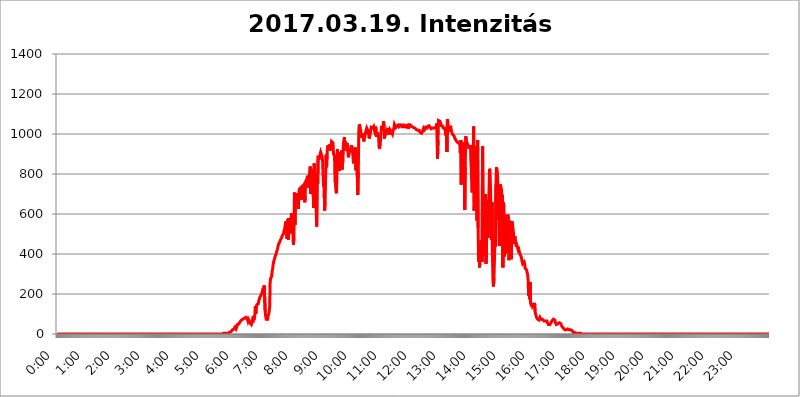
| Category | 2017.03.19. Intenzitás [W/m^2] |
|---|---|
| 0.0 | 0 |
| 0.0006944444444444445 | 0 |
| 0.001388888888888889 | 0 |
| 0.0020833333333333333 | 0 |
| 0.002777777777777778 | 0 |
| 0.003472222222222222 | 0 |
| 0.004166666666666667 | 0 |
| 0.004861111111111111 | 0 |
| 0.005555555555555556 | 0 |
| 0.0062499999999999995 | 0 |
| 0.006944444444444444 | 0 |
| 0.007638888888888889 | 0 |
| 0.008333333333333333 | 0 |
| 0.009027777777777779 | 0 |
| 0.009722222222222222 | 0 |
| 0.010416666666666666 | 0 |
| 0.011111111111111112 | 0 |
| 0.011805555555555555 | 0 |
| 0.012499999999999999 | 0 |
| 0.013194444444444444 | 0 |
| 0.013888888888888888 | 0 |
| 0.014583333333333332 | 0 |
| 0.015277777777777777 | 0 |
| 0.015972222222222224 | 0 |
| 0.016666666666666666 | 0 |
| 0.017361111111111112 | 0 |
| 0.018055555555555557 | 0 |
| 0.01875 | 0 |
| 0.019444444444444445 | 0 |
| 0.02013888888888889 | 0 |
| 0.020833333333333332 | 0 |
| 0.02152777777777778 | 0 |
| 0.022222222222222223 | 0 |
| 0.02291666666666667 | 0 |
| 0.02361111111111111 | 0 |
| 0.024305555555555556 | 0 |
| 0.024999999999999998 | 0 |
| 0.025694444444444447 | 0 |
| 0.02638888888888889 | 0 |
| 0.027083333333333334 | 0 |
| 0.027777777777777776 | 0 |
| 0.02847222222222222 | 0 |
| 0.029166666666666664 | 0 |
| 0.029861111111111113 | 0 |
| 0.030555555555555555 | 0 |
| 0.03125 | 0 |
| 0.03194444444444445 | 0 |
| 0.03263888888888889 | 0 |
| 0.03333333333333333 | 0 |
| 0.034027777777777775 | 0 |
| 0.034722222222222224 | 0 |
| 0.035416666666666666 | 0 |
| 0.036111111111111115 | 0 |
| 0.03680555555555556 | 0 |
| 0.0375 | 0 |
| 0.03819444444444444 | 0 |
| 0.03888888888888889 | 0 |
| 0.03958333333333333 | 0 |
| 0.04027777777777778 | 0 |
| 0.04097222222222222 | 0 |
| 0.041666666666666664 | 0 |
| 0.042361111111111106 | 0 |
| 0.04305555555555556 | 0 |
| 0.043750000000000004 | 0 |
| 0.044444444444444446 | 0 |
| 0.04513888888888889 | 0 |
| 0.04583333333333334 | 0 |
| 0.04652777777777778 | 0 |
| 0.04722222222222222 | 0 |
| 0.04791666666666666 | 0 |
| 0.04861111111111111 | 0 |
| 0.049305555555555554 | 0 |
| 0.049999999999999996 | 0 |
| 0.05069444444444445 | 0 |
| 0.051388888888888894 | 0 |
| 0.052083333333333336 | 0 |
| 0.05277777777777778 | 0 |
| 0.05347222222222222 | 0 |
| 0.05416666666666667 | 0 |
| 0.05486111111111111 | 0 |
| 0.05555555555555555 | 0 |
| 0.05625 | 0 |
| 0.05694444444444444 | 0 |
| 0.057638888888888885 | 0 |
| 0.05833333333333333 | 0 |
| 0.05902777777777778 | 0 |
| 0.059722222222222225 | 0 |
| 0.06041666666666667 | 0 |
| 0.061111111111111116 | 0 |
| 0.06180555555555556 | 0 |
| 0.0625 | 0 |
| 0.06319444444444444 | 0 |
| 0.06388888888888888 | 0 |
| 0.06458333333333334 | 0 |
| 0.06527777777777778 | 0 |
| 0.06597222222222222 | 0 |
| 0.06666666666666667 | 0 |
| 0.06736111111111111 | 0 |
| 0.06805555555555555 | 0 |
| 0.06874999999999999 | 0 |
| 0.06944444444444443 | 0 |
| 0.07013888888888889 | 0 |
| 0.07083333333333333 | 0 |
| 0.07152777777777779 | 0 |
| 0.07222222222222223 | 0 |
| 0.07291666666666667 | 0 |
| 0.07361111111111111 | 0 |
| 0.07430555555555556 | 0 |
| 0.075 | 0 |
| 0.07569444444444444 | 0 |
| 0.0763888888888889 | 0 |
| 0.07708333333333334 | 0 |
| 0.07777777777777778 | 0 |
| 0.07847222222222222 | 0 |
| 0.07916666666666666 | 0 |
| 0.0798611111111111 | 0 |
| 0.08055555555555556 | 0 |
| 0.08125 | 0 |
| 0.08194444444444444 | 0 |
| 0.08263888888888889 | 0 |
| 0.08333333333333333 | 0 |
| 0.08402777777777777 | 0 |
| 0.08472222222222221 | 0 |
| 0.08541666666666665 | 0 |
| 0.08611111111111112 | 0 |
| 0.08680555555555557 | 0 |
| 0.08750000000000001 | 0 |
| 0.08819444444444445 | 0 |
| 0.08888888888888889 | 0 |
| 0.08958333333333333 | 0 |
| 0.09027777777777778 | 0 |
| 0.09097222222222222 | 0 |
| 0.09166666666666667 | 0 |
| 0.09236111111111112 | 0 |
| 0.09305555555555556 | 0 |
| 0.09375 | 0 |
| 0.09444444444444444 | 0 |
| 0.09513888888888888 | 0 |
| 0.09583333333333333 | 0 |
| 0.09652777777777777 | 0 |
| 0.09722222222222222 | 0 |
| 0.09791666666666667 | 0 |
| 0.09861111111111111 | 0 |
| 0.09930555555555555 | 0 |
| 0.09999999999999999 | 0 |
| 0.10069444444444443 | 0 |
| 0.1013888888888889 | 0 |
| 0.10208333333333335 | 0 |
| 0.10277777777777779 | 0 |
| 0.10347222222222223 | 0 |
| 0.10416666666666667 | 0 |
| 0.10486111111111111 | 0 |
| 0.10555555555555556 | 0 |
| 0.10625 | 0 |
| 0.10694444444444444 | 0 |
| 0.1076388888888889 | 0 |
| 0.10833333333333334 | 0 |
| 0.10902777777777778 | 0 |
| 0.10972222222222222 | 0 |
| 0.1111111111111111 | 0 |
| 0.11180555555555556 | 0 |
| 0.11180555555555556 | 0 |
| 0.1125 | 0 |
| 0.11319444444444444 | 0 |
| 0.11388888888888889 | 0 |
| 0.11458333333333333 | 0 |
| 0.11527777777777777 | 0 |
| 0.11597222222222221 | 0 |
| 0.11666666666666665 | 0 |
| 0.1173611111111111 | 0 |
| 0.11805555555555557 | 0 |
| 0.11944444444444445 | 0 |
| 0.12013888888888889 | 0 |
| 0.12083333333333333 | 0 |
| 0.12152777777777778 | 0 |
| 0.12222222222222223 | 0 |
| 0.12291666666666667 | 0 |
| 0.12291666666666667 | 0 |
| 0.12361111111111112 | 0 |
| 0.12430555555555556 | 0 |
| 0.125 | 0 |
| 0.12569444444444444 | 0 |
| 0.12638888888888888 | 0 |
| 0.12708333333333333 | 0 |
| 0.16875 | 0 |
| 0.12847222222222224 | 0 |
| 0.12916666666666668 | 0 |
| 0.12986111111111112 | 0 |
| 0.13055555555555556 | 0 |
| 0.13125 | 0 |
| 0.13194444444444445 | 0 |
| 0.1326388888888889 | 0 |
| 0.13333333333333333 | 0 |
| 0.13402777777777777 | 0 |
| 0.13402777777777777 | 0 |
| 0.13472222222222222 | 0 |
| 0.13541666666666666 | 0 |
| 0.1361111111111111 | 0 |
| 0.13749999999999998 | 0 |
| 0.13819444444444443 | 0 |
| 0.1388888888888889 | 0 |
| 0.13958333333333334 | 0 |
| 0.14027777777777778 | 0 |
| 0.14097222222222222 | 0 |
| 0.14166666666666666 | 0 |
| 0.1423611111111111 | 0 |
| 0.14305555555555557 | 0 |
| 0.14375000000000002 | 0 |
| 0.14444444444444446 | 0 |
| 0.1451388888888889 | 0 |
| 0.1451388888888889 | 0 |
| 0.14652777777777778 | 0 |
| 0.14722222222222223 | 0 |
| 0.14791666666666667 | 0 |
| 0.1486111111111111 | 0 |
| 0.14930555555555555 | 0 |
| 0.15 | 0 |
| 0.15069444444444444 | 0 |
| 0.15138888888888888 | 0 |
| 0.15208333333333332 | 0 |
| 0.15277777777777776 | 0 |
| 0.15347222222222223 | 0 |
| 0.15416666666666667 | 0 |
| 0.15486111111111112 | 0 |
| 0.15555555555555556 | 0 |
| 0.15625 | 0 |
| 0.15694444444444444 | 0 |
| 0.15763888888888888 | 0 |
| 0.15833333333333333 | 0 |
| 0.15902777777777777 | 0 |
| 0.15972222222222224 | 0 |
| 0.16041666666666668 | 0 |
| 0.16111111111111112 | 0 |
| 0.16180555555555556 | 0 |
| 0.1625 | 0 |
| 0.16319444444444445 | 0 |
| 0.1638888888888889 | 0 |
| 0.16458333333333333 | 0 |
| 0.16527777777777777 | 0 |
| 0.16597222222222222 | 0 |
| 0.16666666666666666 | 0 |
| 0.1673611111111111 | 0 |
| 0.16805555555555554 | 0 |
| 0.16874999999999998 | 0 |
| 0.16944444444444443 | 0 |
| 0.17013888888888887 | 0 |
| 0.1708333333333333 | 0 |
| 0.17152777777777775 | 0 |
| 0.17222222222222225 | 0 |
| 0.1729166666666667 | 0 |
| 0.17361111111111113 | 0 |
| 0.17430555555555557 | 0 |
| 0.17500000000000002 | 0 |
| 0.17569444444444446 | 0 |
| 0.1763888888888889 | 0 |
| 0.17708333333333334 | 0 |
| 0.17777777777777778 | 0 |
| 0.17847222222222223 | 0 |
| 0.17916666666666667 | 0 |
| 0.1798611111111111 | 0 |
| 0.18055555555555555 | 0 |
| 0.18125 | 0 |
| 0.18194444444444444 | 0 |
| 0.1826388888888889 | 0 |
| 0.18333333333333335 | 0 |
| 0.1840277777777778 | 0 |
| 0.18472222222222223 | 0 |
| 0.18541666666666667 | 0 |
| 0.18611111111111112 | 0 |
| 0.18680555555555556 | 0 |
| 0.1875 | 0 |
| 0.18819444444444444 | 0 |
| 0.18888888888888888 | 0 |
| 0.18958333333333333 | 0 |
| 0.19027777777777777 | 0 |
| 0.1909722222222222 | 0 |
| 0.19166666666666665 | 0 |
| 0.19236111111111112 | 0 |
| 0.19305555555555554 | 0 |
| 0.19375 | 0 |
| 0.19444444444444445 | 0 |
| 0.1951388888888889 | 0 |
| 0.19583333333333333 | 0 |
| 0.19652777777777777 | 0 |
| 0.19722222222222222 | 0 |
| 0.19791666666666666 | 0 |
| 0.1986111111111111 | 0 |
| 0.19930555555555554 | 0 |
| 0.19999999999999998 | 0 |
| 0.20069444444444443 | 0 |
| 0.20138888888888887 | 0 |
| 0.2020833333333333 | 0 |
| 0.2027777777777778 | 0 |
| 0.2034722222222222 | 0 |
| 0.2041666666666667 | 0 |
| 0.20486111111111113 | 0 |
| 0.20555555555555557 | 0 |
| 0.20625000000000002 | 0 |
| 0.20694444444444446 | 0 |
| 0.2076388888888889 | 0 |
| 0.20833333333333334 | 0 |
| 0.20902777777777778 | 0 |
| 0.20972222222222223 | 0 |
| 0.21041666666666667 | 0 |
| 0.2111111111111111 | 0 |
| 0.21180555555555555 | 0 |
| 0.2125 | 0 |
| 0.21319444444444444 | 0 |
| 0.2138888888888889 | 0 |
| 0.21458333333333335 | 0 |
| 0.2152777777777778 | 0 |
| 0.21597222222222223 | 0 |
| 0.21666666666666667 | 0 |
| 0.21736111111111112 | 0 |
| 0.21805555555555556 | 0 |
| 0.21875 | 0 |
| 0.21944444444444444 | 0 |
| 0.22013888888888888 | 0 |
| 0.22083333333333333 | 0 |
| 0.22152777777777777 | 0 |
| 0.2222222222222222 | 0 |
| 0.22291666666666665 | 0 |
| 0.2236111111111111 | 0 |
| 0.22430555555555556 | 0 |
| 0.225 | 0 |
| 0.22569444444444445 | 0 |
| 0.2263888888888889 | 0 |
| 0.22708333333333333 | 0 |
| 0.22777777777777777 | 0 |
| 0.22847222222222222 | 0 |
| 0.22916666666666666 | 0 |
| 0.2298611111111111 | 0 |
| 0.23055555555555554 | 0 |
| 0.23124999999999998 | 0 |
| 0.23194444444444443 | 0 |
| 0.23263888888888887 | 0 |
| 0.2333333333333333 | 3.525 |
| 0.2340277777777778 | 3.525 |
| 0.2347222222222222 | 3.525 |
| 0.2354166666666667 | 3.525 |
| 0.23611111111111113 | 3.525 |
| 0.23680555555555557 | 3.525 |
| 0.23750000000000002 | 3.525 |
| 0.23819444444444446 | 3.525 |
| 0.2388888888888889 | 3.525 |
| 0.23958333333333334 | 3.525 |
| 0.24027777777777778 | 7.887 |
| 0.24097222222222223 | 7.887 |
| 0.24166666666666667 | 7.887 |
| 0.2423611111111111 | 7.887 |
| 0.24305555555555555 | 12.257 |
| 0.24375 | 12.257 |
| 0.24444444444444446 | 16.636 |
| 0.24513888888888888 | 16.636 |
| 0.24583333333333335 | 21.024 |
| 0.2465277777777778 | 21.024 |
| 0.24722222222222223 | 25.419 |
| 0.24791666666666667 | 25.419 |
| 0.24861111111111112 | 29.823 |
| 0.24930555555555556 | 34.234 |
| 0.25 | 29.823 |
| 0.25069444444444444 | 25.419 |
| 0.2513888888888889 | 29.823 |
| 0.2520833333333333 | 38.653 |
| 0.25277777777777777 | 47.511 |
| 0.2534722222222222 | 47.511 |
| 0.25416666666666665 | 47.511 |
| 0.2548611111111111 | 51.951 |
| 0.2555555555555556 | 56.398 |
| 0.25625000000000003 | 60.85 |
| 0.2569444444444445 | 60.85 |
| 0.2576388888888889 | 65.31 |
| 0.25833333333333336 | 69.775 |
| 0.2590277777777778 | 74.246 |
| 0.25972222222222224 | 74.246 |
| 0.2604166666666667 | 74.246 |
| 0.2611111111111111 | 74.246 |
| 0.26180555555555557 | 74.246 |
| 0.2625 | 78.722 |
| 0.26319444444444445 | 78.722 |
| 0.2638888888888889 | 78.722 |
| 0.26458333333333334 | 83.205 |
| 0.2652777777777778 | 83.205 |
| 0.2659722222222222 | 87.692 |
| 0.26666666666666666 | 74.246 |
| 0.2673611111111111 | 65.31 |
| 0.26805555555555555 | 74.246 |
| 0.26875 | 78.722 |
| 0.26944444444444443 | 65.31 |
| 0.2701388888888889 | 56.398 |
| 0.2708333333333333 | 51.951 |
| 0.27152777777777776 | 51.951 |
| 0.2722222222222222 | 47.511 |
| 0.27291666666666664 | 51.951 |
| 0.2736111111111111 | 65.31 |
| 0.2743055555555555 | 56.398 |
| 0.27499999999999997 | 87.692 |
| 0.27569444444444446 | 69.775 |
| 0.27638888888888885 | 69.775 |
| 0.27708333333333335 | 92.184 |
| 0.2777777777777778 | 137.347 |
| 0.27847222222222223 | 101.184 |
| 0.2791666666666667 | 137.347 |
| 0.2798611111111111 | 146.423 |
| 0.28055555555555556 | 141.884 |
| 0.28125 | 150.964 |
| 0.28194444444444444 | 150.964 |
| 0.2826388888888889 | 164.605 |
| 0.2833333333333333 | 173.709 |
| 0.28402777777777777 | 182.82 |
| 0.2847222222222222 | 187.378 |
| 0.28541666666666665 | 187.378 |
| 0.28611111111111115 | 196.497 |
| 0.28680555555555554 | 201.058 |
| 0.28750000000000003 | 210.182 |
| 0.2881944444444445 | 214.746 |
| 0.2888888888888889 | 228.436 |
| 0.28958333333333336 | 210.182 |
| 0.2902777777777778 | 242.127 |
| 0.29097222222222224 | 237.564 |
| 0.2916666666666667 | 110.201 |
| 0.2923611111111111 | 87.692 |
| 0.29305555555555557 | 74.246 |
| 0.29375 | 74.246 |
| 0.29444444444444445 | 74.246 |
| 0.2951388888888889 | 74.246 |
| 0.29583333333333334 | 92.184 |
| 0.2965277777777778 | 92.184 |
| 0.2972222222222222 | 110.201 |
| 0.29791666666666666 | 137.347 |
| 0.2986111111111111 | 260.373 |
| 0.29930555555555555 | 278.603 |
| 0.3 | 283.156 |
| 0.30069444444444443 | 287.709 |
| 0.3013888888888889 | 314.98 |
| 0.3020833333333333 | 324.052 |
| 0.30277777777777776 | 346.682 |
| 0.3034722222222222 | 360.221 |
| 0.30416666666666664 | 369.23 |
| 0.3048611111111111 | 378.224 |
| 0.3055555555555555 | 387.202 |
| 0.30624999999999997 | 391.685 |
| 0.3069444444444444 | 400.638 |
| 0.3076388888888889 | 405.108 |
| 0.30833333333333335 | 418.492 |
| 0.3090277777777778 | 427.39 |
| 0.30972222222222223 | 440.702 |
| 0.3104166666666667 | 449.551 |
| 0.3111111111111111 | 453.968 |
| 0.31180555555555556 | 458.38 |
| 0.3125 | 462.786 |
| 0.31319444444444444 | 471.582 |
| 0.3138888888888889 | 475.972 |
| 0.3145833333333333 | 480.356 |
| 0.31527777777777777 | 489.108 |
| 0.3159722222222222 | 489.108 |
| 0.31666666666666665 | 493.475 |
| 0.31736111111111115 | 502.192 |
| 0.31805555555555554 | 515.223 |
| 0.31875000000000003 | 523.88 |
| 0.3194444444444445 | 536.82 |
| 0.3201388888888889 | 553.986 |
| 0.32083333333333336 | 562.53 |
| 0.3215277777777778 | 515.223 |
| 0.32222222222222224 | 475.972 |
| 0.3229166666666667 | 575.299 |
| 0.3236111111111111 | 493.475 |
| 0.32430555555555557 | 471.582 |
| 0.325 | 579.542 |
| 0.32569444444444445 | 575.299 |
| 0.3263888888888889 | 502.192 |
| 0.32708333333333334 | 515.223 |
| 0.3277777777777778 | 575.299 |
| 0.3284722222222222 | 604.864 |
| 0.32916666666666666 | 558.261 |
| 0.3298611111111111 | 510.885 |
| 0.33055555555555555 | 575.299 |
| 0.33125 | 445.129 |
| 0.33194444444444443 | 480.356 |
| 0.3326388888888889 | 707.8 |
| 0.3333333333333333 | 545.416 |
| 0.3340277777777778 | 703.762 |
| 0.3347222222222222 | 695.666 |
| 0.3354166666666667 | 695.666 |
| 0.3361111111111111 | 691.608 |
| 0.3368055555555556 | 683.473 |
| 0.33749999999999997 | 683.473 |
| 0.33819444444444446 | 625.784 |
| 0.33888888888888885 | 703.762 |
| 0.33958333333333335 | 723.889 |
| 0.34027777777777773 | 727.896 |
| 0.34097222222222223 | 727.896 |
| 0.3416666666666666 | 731.896 |
| 0.3423611111111111 | 671.22 |
| 0.3430555555555555 | 735.89 |
| 0.34375 | 719.877 |
| 0.3444444444444445 | 715.858 |
| 0.3451388888888889 | 735.89 |
| 0.3458333333333334 | 727.896 |
| 0.34652777777777777 | 747.834 |
| 0.34722222222222227 | 658.909 |
| 0.34791666666666665 | 755.766 |
| 0.34861111111111115 | 763.674 |
| 0.34930555555555554 | 767.62 |
| 0.35000000000000003 | 775.492 |
| 0.3506944444444444 | 783.342 |
| 0.3513888888888889 | 791.169 |
| 0.3520833333333333 | 731.896 |
| 0.3527777777777778 | 775.492 |
| 0.3534722222222222 | 798.974 |
| 0.3541666666666667 | 806.757 |
| 0.3548611111111111 | 837.682 |
| 0.35555555555555557 | 699.717 |
| 0.35625 | 791.169 |
| 0.35694444444444445 | 787.258 |
| 0.3576388888888889 | 826.123 |
| 0.35833333333333334 | 829.981 |
| 0.3590277777777778 | 687.544 |
| 0.3597222222222222 | 629.948 |
| 0.36041666666666666 | 853.029 |
| 0.3611111111111111 | 814.519 |
| 0.36180555555555555 | 791.169 |
| 0.3625 | 679.395 |
| 0.36319444444444443 | 613.252 |
| 0.3638888888888889 | 536.82 |
| 0.3645833333333333 | 787.258 |
| 0.3652777777777778 | 751.803 |
| 0.3659722222222222 | 891.099 |
| 0.3666666666666667 | 872.114 |
| 0.3673611111111111 | 879.719 |
| 0.3680555555555556 | 883.516 |
| 0.36874999999999997 | 883.516 |
| 0.36944444444444446 | 909.996 |
| 0.37013888888888885 | 902.447 |
| 0.37083333333333335 | 902.447 |
| 0.37152777777777773 | 883.516 |
| 0.37222222222222223 | 860.676 |
| 0.3729166666666666 | 787.258 |
| 0.3736111111111111 | 735.89 |
| 0.3743055555555555 | 743.859 |
| 0.375 | 617.436 |
| 0.3756944444444445 | 658.909 |
| 0.3763888888888889 | 779.42 |
| 0.3770833333333334 | 894.885 |
| 0.37777777777777777 | 833.834 |
| 0.37847222222222227 | 902.447 |
| 0.37916666666666665 | 936.33 |
| 0.37986111111111115 | 943.832 |
| 0.38055555555555554 | 928.819 |
| 0.38125000000000003 | 936.33 |
| 0.3819444444444444 | 947.58 |
| 0.3826388888888889 | 917.534 |
| 0.3833333333333333 | 917.534 |
| 0.3840277777777778 | 940.082 |
| 0.3847222222222222 | 962.555 |
| 0.3854166666666667 | 962.555 |
| 0.3861111111111111 | 966.295 |
| 0.38680555555555557 | 955.071 |
| 0.3875 | 898.668 |
| 0.38819444444444445 | 902.447 |
| 0.3888888888888889 | 891.099 |
| 0.38958333333333334 | 763.674 |
| 0.3902777777777778 | 751.803 |
| 0.3909722222222222 | 711.832 |
| 0.39166666666666666 | 703.762 |
| 0.3923611111111111 | 898.668 |
| 0.39305555555555555 | 925.06 |
| 0.39375 | 845.365 |
| 0.39444444444444443 | 909.996 |
| 0.3951388888888889 | 879.719 |
| 0.3958333333333333 | 814.519 |
| 0.3965277777777778 | 894.885 |
| 0.3972222222222222 | 841.526 |
| 0.3979166666666667 | 887.309 |
| 0.3986111111111111 | 917.534 |
| 0.3993055555555556 | 822.26 |
| 0.39999999999999997 | 849.199 |
| 0.40069444444444446 | 860.676 |
| 0.40138888888888885 | 955.071 |
| 0.40208333333333335 | 970.034 |
| 0.40277777777777773 | 984.98 |
| 0.40347222222222223 | 936.33 |
| 0.4041666666666666 | 962.555 |
| 0.4048611111111111 | 917.534 |
| 0.4055555555555555 | 943.832 |
| 0.40625 | 955.071 |
| 0.4069444444444445 | 943.832 |
| 0.4076388888888889 | 909.996 |
| 0.4083333333333334 | 883.516 |
| 0.40902777777777777 | 898.668 |
| 0.40972222222222227 | 902.447 |
| 0.41041666666666665 | 917.534 |
| 0.41111111111111115 | 917.534 |
| 0.41180555555555554 | 932.576 |
| 0.41250000000000003 | 943.832 |
| 0.4131944444444444 | 940.082 |
| 0.4138888888888889 | 925.06 |
| 0.4145833333333333 | 894.885 |
| 0.4152777777777778 | 860.676 |
| 0.4159722222222222 | 853.029 |
| 0.4166666666666667 | 872.114 |
| 0.4173611111111111 | 872.114 |
| 0.41805555555555557 | 932.576 |
| 0.41875 | 818.392 |
| 0.41944444444444445 | 829.981 |
| 0.4201388888888889 | 883.516 |
| 0.42083333333333334 | 783.342 |
| 0.4215277777777778 | 695.666 |
| 0.4222222222222222 | 810.641 |
| 0.42291666666666666 | 1014.852 |
| 0.4236111111111111 | 1048.508 |
| 0.42430555555555555 | 1041.019 |
| 0.425 | 1041.019 |
| 0.42569444444444443 | 1014.852 |
| 0.4263888888888889 | 981.244 |
| 0.4270833333333333 | 988.714 |
| 0.4277777777777778 | 992.448 |
| 0.4284722222222222 | 1003.65 |
| 0.4291666666666667 | 984.98 |
| 0.4298611111111111 | 962.555 |
| 0.4305555555555556 | 973.772 |
| 0.43124999999999997 | 984.98 |
| 0.43194444444444446 | 996.182 |
| 0.43263888888888885 | 1011.118 |
| 0.43333333333333335 | 1014.852 |
| 0.43402777777777773 | 1029.798 |
| 0.43472222222222223 | 1026.06 |
| 0.4354166666666666 | 1018.587 |
| 0.4361111111111111 | 1014.852 |
| 0.4368055555555555 | 999.916 |
| 0.4375 | 977.508 |
| 0.4381944444444445 | 973.772 |
| 0.4388888888888889 | 977.508 |
| 0.4395833333333334 | 1018.587 |
| 0.44027777777777777 | 1033.537 |
| 0.44097222222222227 | 1033.537 |
| 0.44166666666666665 | 1033.537 |
| 0.44236111111111115 | 1029.798 |
| 0.44305555555555554 | 1033.537 |
| 0.44375000000000003 | 1037.277 |
| 0.4444444444444444 | 1026.06 |
| 0.4451388888888889 | 1014.852 |
| 0.4458333333333333 | 1022.323 |
| 0.4465277777777778 | 1037.277 |
| 0.4472222222222222 | 1018.587 |
| 0.4479166666666667 | 984.98 |
| 0.4486111111111111 | 988.714 |
| 0.44930555555555557 | 1007.383 |
| 0.45 | 992.448 |
| 0.45069444444444445 | 984.98 |
| 0.4513888888888889 | 936.33 |
| 0.45208333333333334 | 925.06 |
| 0.4527777777777778 | 955.071 |
| 0.4534722222222222 | 966.295 |
| 0.45416666666666666 | 1011.118 |
| 0.4548611111111111 | 1041.019 |
| 0.45555555555555555 | 1029.798 |
| 0.45625 | 1018.587 |
| 0.45694444444444443 | 1029.798 |
| 0.4576388888888889 | 1063.51 |
| 0.4583333333333333 | 1033.537 |
| 0.4590277777777778 | 977.508 |
| 0.4597222222222222 | 1022.323 |
| 0.4604166666666667 | 1022.323 |
| 0.4611111111111111 | 1007.383 |
| 0.4618055555555556 | 1014.852 |
| 0.46249999999999997 | 1007.383 |
| 0.46319444444444446 | 1029.798 |
| 0.46388888888888885 | 1014.852 |
| 0.46458333333333335 | 1018.587 |
| 0.46527777777777773 | 996.182 |
| 0.46597222222222223 | 1007.383 |
| 0.4666666666666666 | 1022.323 |
| 0.4673611111111111 | 1018.587 |
| 0.4680555555555555 | 1014.852 |
| 0.46875 | 1018.587 |
| 0.4694444444444445 | 1011.118 |
| 0.4701388888888889 | 999.916 |
| 0.4708333333333334 | 1014.852 |
| 0.47152777777777777 | 1022.323 |
| 0.47222222222222227 | 1029.798 |
| 0.47291666666666665 | 1048.508 |
| 0.47361111111111115 | 1044.762 |
| 0.47430555555555554 | 1044.762 |
| 0.47500000000000003 | 1033.537 |
| 0.4756944444444444 | 1029.798 |
| 0.4763888888888889 | 1041.019 |
| 0.4770833333333333 | 1044.762 |
| 0.4777777777777778 | 1044.762 |
| 0.4784722222222222 | 1044.762 |
| 0.4791666666666667 | 1037.277 |
| 0.4798611111111111 | 1041.019 |
| 0.48055555555555557 | 1033.537 |
| 0.48125 | 1044.762 |
| 0.48194444444444445 | 1041.019 |
| 0.4826388888888889 | 1041.019 |
| 0.48333333333333334 | 1037.277 |
| 0.4840277777777778 | 1029.798 |
| 0.4847222222222222 | 1044.762 |
| 0.48541666666666666 | 1044.762 |
| 0.4861111111111111 | 1044.762 |
| 0.48680555555555555 | 1044.762 |
| 0.4875 | 1029.798 |
| 0.48819444444444443 | 1041.019 |
| 0.4888888888888889 | 1029.798 |
| 0.4895833333333333 | 1041.019 |
| 0.4902777777777778 | 1044.762 |
| 0.4909722222222222 | 1041.019 |
| 0.4916666666666667 | 1044.762 |
| 0.4923611111111111 | 1026.06 |
| 0.4930555555555556 | 1033.537 |
| 0.49374999999999997 | 1029.798 |
| 0.49444444444444446 | 1037.277 |
| 0.49513888888888885 | 1044.762 |
| 0.49583333333333335 | 1044.762 |
| 0.49652777777777773 | 1041.019 |
| 0.49722222222222223 | 1037.277 |
| 0.4979166666666666 | 1033.537 |
| 0.4986111111111111 | 1041.019 |
| 0.4993055555555555 | 1033.537 |
| 0.5 | 1037.277 |
| 0.5006944444444444 | 1029.798 |
| 0.5013888888888889 | 1029.798 |
| 0.5020833333333333 | 1029.798 |
| 0.5027777777777778 | 1026.06 |
| 0.5034722222222222 | 1022.323 |
| 0.5041666666666667 | 1018.587 |
| 0.5048611111111111 | 1018.587 |
| 0.5055555555555555 | 1018.587 |
| 0.50625 | 1014.852 |
| 0.5069444444444444 | 1018.587 |
| 0.5076388888888889 | 1018.587 |
| 0.5083333333333333 | 1014.852 |
| 0.5090277777777777 | 1007.383 |
| 0.5097222222222222 | 1003.65 |
| 0.5104166666666666 | 1007.383 |
| 0.5111111111111112 | 1003.65 |
| 0.5118055555555555 | 1003.65 |
| 0.5125000000000001 | 1014.852 |
| 0.5131944444444444 | 1014.852 |
| 0.513888888888889 | 1029.798 |
| 0.5145833333333333 | 1029.798 |
| 0.5152777777777778 | 1022.323 |
| 0.5159722222222222 | 1022.323 |
| 0.5166666666666667 | 1033.537 |
| 0.517361111111111 | 1033.537 |
| 0.5180555555555556 | 1029.798 |
| 0.5187499999999999 | 1029.798 |
| 0.5194444444444445 | 1037.277 |
| 0.5201388888888888 | 1037.277 |
| 0.5208333333333334 | 1041.019 |
| 0.5215277777777778 | 1041.019 |
| 0.5222222222222223 | 1037.277 |
| 0.5229166666666667 | 1033.537 |
| 0.5236111111111111 | 1033.537 |
| 0.5243055555555556 | 1026.06 |
| 0.525 | 1022.323 |
| 0.5256944444444445 | 1026.06 |
| 0.5263888888888889 | 1029.798 |
| 0.5270833333333333 | 1033.537 |
| 0.5277777777777778 | 1029.798 |
| 0.5284722222222222 | 1029.798 |
| 0.5291666666666667 | 1029.798 |
| 0.5298611111111111 | 1029.798 |
| 0.5305555555555556 | 1029.798 |
| 0.53125 | 1026.06 |
| 0.5319444444444444 | 1033.537 |
| 0.5326388888888889 | 1052.255 |
| 0.5333333333333333 | 875.918 |
| 0.5340277777777778 | 970.034 |
| 0.5347222222222222 | 1067.267 |
| 0.5354166666666667 | 1071.027 |
| 0.5361111111111111 | 1071.027 |
| 0.5368055555555555 | 1063.51 |
| 0.5375 | 1056.004 |
| 0.5381944444444444 | 1048.508 |
| 0.5388888888888889 | 1041.019 |
| 0.5395833333333333 | 1037.277 |
| 0.5402777777777777 | 1037.277 |
| 0.5409722222222222 | 1037.277 |
| 0.5416666666666666 | 1029.798 |
| 0.5423611111111112 | 1029.798 |
| 0.5430555555555555 | 1029.798 |
| 0.5437500000000001 | 1026.06 |
| 0.5444444444444444 | 1022.323 |
| 0.545138888888889 | 992.448 |
| 0.5458333333333333 | 1033.537 |
| 0.5465277777777778 | 909.996 |
| 0.5472222222222222 | 1074.789 |
| 0.5479166666666667 | 1052.255 |
| 0.548611111111111 | 1033.537 |
| 0.5493055555555556 | 1018.587 |
| 0.5499999999999999 | 1018.587 |
| 0.5506944444444445 | 1026.06 |
| 0.5513888888888888 | 1041.019 |
| 0.5520833333333334 | 1033.537 |
| 0.5527777777777778 | 1014.852 |
| 0.5534722222222223 | 1007.383 |
| 0.5541666666666667 | 999.916 |
| 0.5548611111111111 | 996.182 |
| 0.5555555555555556 | 996.182 |
| 0.55625 | 992.448 |
| 0.5569444444444445 | 984.98 |
| 0.5576388888888889 | 981.244 |
| 0.5583333333333333 | 973.772 |
| 0.5590277777777778 | 973.772 |
| 0.5597222222222222 | 966.295 |
| 0.5604166666666667 | 962.555 |
| 0.5611111111111111 | 958.814 |
| 0.5618055555555556 | 958.814 |
| 0.5625 | 958.814 |
| 0.5631944444444444 | 955.071 |
| 0.5638888888888889 | 955.071 |
| 0.5645833333333333 | 947.58 |
| 0.5652777777777778 | 906.223 |
| 0.5659722222222222 | 970.034 |
| 0.5666666666666667 | 747.834 |
| 0.5673611111111111 | 958.814 |
| 0.5680555555555555 | 787.258 |
| 0.56875 | 928.819 |
| 0.5694444444444444 | 822.26 |
| 0.5701388888888889 | 841.526 |
| 0.5708333333333333 | 958.814 |
| 0.5715277777777777 | 621.613 |
| 0.5722222222222222 | 837.682 |
| 0.5729166666666666 | 988.714 |
| 0.5736111111111112 | 966.295 |
| 0.5743055555555555 | 962.555 |
| 0.5750000000000001 | 955.071 |
| 0.5756944444444444 | 951.327 |
| 0.576388888888889 | 940.082 |
| 0.5770833333333333 | 932.576 |
| 0.5777777777777778 | 936.33 |
| 0.5784722222222222 | 936.33 |
| 0.5791666666666667 | 932.576 |
| 0.579861111111111 | 943.832 |
| 0.5805555555555556 | 947.58 |
| 0.5812499999999999 | 767.62 |
| 0.5819444444444445 | 707.8 |
| 0.5826388888888888 | 802.868 |
| 0.5833333333333334 | 872.114 |
| 0.5840277777777778 | 1037.277 |
| 0.5847222222222223 | 617.436 |
| 0.5854166666666667 | 658.909 |
| 0.5861111111111111 | 731.896 |
| 0.5868055555555556 | 940.082 |
| 0.5875 | 687.544 |
| 0.5881944444444445 | 833.834 |
| 0.5888888888888889 | 566.793 |
| 0.5895833333333333 | 970.034 |
| 0.5902777777777778 | 532.513 |
| 0.5909722222222222 | 360.221 |
| 0.5916666666666667 | 418.492 |
| 0.5923611111111111 | 333.113 |
| 0.5930555555555556 | 431.833 |
| 0.59375 | 400.638 |
| 0.5944444444444444 | 467.187 |
| 0.5951388888888889 | 396.164 |
| 0.5958333333333333 | 360.221 |
| 0.5965277777777778 | 940.082 |
| 0.5972222222222222 | 629.948 |
| 0.5979166666666667 | 391.685 |
| 0.5986111111111111 | 387.202 |
| 0.5993055555555555 | 506.542 |
| 0.6 | 549.704 |
| 0.6006944444444444 | 699.717 |
| 0.6013888888888889 | 351.198 |
| 0.6020833333333333 | 449.551 |
| 0.6027777777777777 | 604.864 |
| 0.6034722222222222 | 671.22 |
| 0.6041666666666666 | 480.356 |
| 0.6048611111111112 | 583.779 |
| 0.6055555555555555 | 719.877 |
| 0.6062500000000001 | 826.123 |
| 0.6069444444444444 | 818.392 |
| 0.607638888888889 | 735.89 |
| 0.6083333333333333 | 588.009 |
| 0.6090277777777778 | 471.582 |
| 0.6097222222222222 | 658.909 |
| 0.6104166666666667 | 387.202 |
| 0.611111111111111 | 269.49 |
| 0.6118055555555556 | 237.564 |
| 0.6124999999999999 | 278.603 |
| 0.6131944444444445 | 369.23 |
| 0.6138888888888888 | 475.972 |
| 0.6145833333333334 | 436.27 |
| 0.6152777777777778 | 747.834 |
| 0.6159722222222223 | 833.834 |
| 0.6166666666666667 | 822.26 |
| 0.6173611111111111 | 806.757 |
| 0.6180555555555556 | 731.896 |
| 0.61875 | 571.049 |
| 0.6194444444444445 | 638.256 |
| 0.6201388888888889 | 440.702 |
| 0.6208333333333333 | 735.89 |
| 0.6215277777777778 | 747.834 |
| 0.6222222222222222 | 731.896 |
| 0.6229166666666667 | 723.889 |
| 0.6236111111111111 | 679.395 |
| 0.6243055555555556 | 695.666 |
| 0.625 | 333.113 |
| 0.6256944444444444 | 658.909 |
| 0.6263888888888889 | 642.4 |
| 0.6270833333333333 | 387.202 |
| 0.6277777777777778 | 545.416 |
| 0.6284722222222222 | 400.638 |
| 0.6291666666666667 | 562.53 |
| 0.6298611111111111 | 596.45 |
| 0.6305555555555555 | 409.574 |
| 0.63125 | 440.702 |
| 0.6319444444444444 | 596.45 |
| 0.6326388888888889 | 579.542 |
| 0.6333333333333333 | 369.23 |
| 0.6340277777777777 | 387.202 |
| 0.6347222222222222 | 566.793 |
| 0.6354166666666666 | 515.223 |
| 0.6361111111111112 | 493.475 |
| 0.6368055555555555 | 373.729 |
| 0.6375000000000001 | 562.53 |
| 0.6381944444444444 | 553.986 |
| 0.638888888888889 | 536.82 |
| 0.6395833333333333 | 515.223 |
| 0.6402777777777778 | 510.885 |
| 0.6409722222222222 | 449.551 |
| 0.6416666666666667 | 489.108 |
| 0.642361111111111 | 467.187 |
| 0.6430555555555556 | 453.968 |
| 0.6437499999999999 | 436.27 |
| 0.6444444444444445 | 445.129 |
| 0.6451388888888888 | 440.702 |
| 0.6458333333333334 | 427.39 |
| 0.6465277777777778 | 436.27 |
| 0.6472222222222223 | 422.943 |
| 0.6479166666666667 | 414.035 |
| 0.6486111111111111 | 409.574 |
| 0.6493055555555556 | 396.164 |
| 0.65 | 396.164 |
| 0.6506944444444445 | 387.202 |
| 0.6513888888888889 | 373.729 |
| 0.6520833333333333 | 360.221 |
| 0.6527777777777778 | 351.198 |
| 0.6534722222222222 | 346.682 |
| 0.6541666666666667 | 351.198 |
| 0.6548611111111111 | 360.221 |
| 0.6555555555555556 | 351.198 |
| 0.65625 | 328.584 |
| 0.6569444444444444 | 333.113 |
| 0.6576388888888889 | 328.584 |
| 0.6583333333333333 | 319.517 |
| 0.6590277777777778 | 305.898 |
| 0.6597222222222222 | 296.808 |
| 0.6604166666666667 | 269.49 |
| 0.6611111111111111 | 191.937 |
| 0.6618055555555555 | 246.689 |
| 0.6625 | 173.709 |
| 0.6631944444444444 | 260.373 |
| 0.6638888888888889 | 155.509 |
| 0.6645833333333333 | 146.423 |
| 0.6652777777777777 | 137.347 |
| 0.6659722222222222 | 155.509 |
| 0.6666666666666666 | 137.347 |
| 0.6673611111111111 | 137.347 |
| 0.6680555555555556 | 141.884 |
| 0.6687500000000001 | 146.423 |
| 0.6694444444444444 | 155.509 |
| 0.6701388888888888 | 114.716 |
| 0.6708333333333334 | 101.184 |
| 0.6715277777777778 | 92.184 |
| 0.6722222222222222 | 83.205 |
| 0.6729166666666666 | 78.722 |
| 0.6736111111111112 | 74.246 |
| 0.6743055555555556 | 69.775 |
| 0.6749999999999999 | 69.775 |
| 0.6756944444444444 | 69.775 |
| 0.6763888888888889 | 74.246 |
| 0.6770833333333334 | 83.205 |
| 0.6777777777777777 | 83.205 |
| 0.6784722222222223 | 74.246 |
| 0.6791666666666667 | 74.246 |
| 0.6798611111111111 | 74.246 |
| 0.6805555555555555 | 74.246 |
| 0.68125 | 74.246 |
| 0.6819444444444445 | 69.775 |
| 0.6826388888888889 | 65.31 |
| 0.6833333333333332 | 60.85 |
| 0.6840277777777778 | 60.85 |
| 0.6847222222222222 | 65.31 |
| 0.6854166666666667 | 65.31 |
| 0.686111111111111 | 65.31 |
| 0.6868055555555556 | 65.31 |
| 0.6875 | 56.398 |
| 0.6881944444444444 | 56.398 |
| 0.688888888888889 | 47.511 |
| 0.6895833333333333 | 47.511 |
| 0.6902777777777778 | 47.511 |
| 0.6909722222222222 | 47.511 |
| 0.6916666666666668 | 47.511 |
| 0.6923611111111111 | 56.398 |
| 0.6930555555555555 | 60.85 |
| 0.69375 | 65.31 |
| 0.6944444444444445 | 65.31 |
| 0.6951388888888889 | 69.775 |
| 0.6958333333333333 | 74.246 |
| 0.6965277777777777 | 74.246 |
| 0.6972222222222223 | 74.246 |
| 0.6979166666666666 | 69.775 |
| 0.6986111111111111 | 56.398 |
| 0.6993055555555556 | 51.951 |
| 0.7000000000000001 | 47.511 |
| 0.7006944444444444 | 47.511 |
| 0.7013888888888888 | 47.511 |
| 0.7020833333333334 | 51.951 |
| 0.7027777777777778 | 51.951 |
| 0.7034722222222222 | 56.398 |
| 0.7041666666666666 | 56.398 |
| 0.7048611111111112 | 56.398 |
| 0.7055555555555556 | 51.951 |
| 0.7062499999999999 | 51.951 |
| 0.7069444444444444 | 47.511 |
| 0.7076388888888889 | 38.653 |
| 0.7083333333333334 | 34.234 |
| 0.7090277777777777 | 34.234 |
| 0.7097222222222223 | 29.823 |
| 0.7104166666666667 | 29.823 |
| 0.7111111111111111 | 25.419 |
| 0.7118055555555555 | 21.024 |
| 0.7125 | 21.024 |
| 0.7131944444444445 | 21.024 |
| 0.7138888888888889 | 21.024 |
| 0.7145833333333332 | 21.024 |
| 0.7152777777777778 | 25.419 |
| 0.7159722222222222 | 25.419 |
| 0.7166666666666667 | 25.419 |
| 0.717361111111111 | 25.419 |
| 0.7180555555555556 | 21.024 |
| 0.71875 | 25.419 |
| 0.7194444444444444 | 25.419 |
| 0.720138888888889 | 21.024 |
| 0.7208333333333333 | 21.024 |
| 0.7215277777777778 | 16.636 |
| 0.7222222222222222 | 16.636 |
| 0.7229166666666668 | 12.257 |
| 0.7236111111111111 | 7.887 |
| 0.7243055555555555 | 7.887 |
| 0.725 | 7.887 |
| 0.7256944444444445 | 7.887 |
| 0.7263888888888889 | 7.887 |
| 0.7270833333333333 | 3.525 |
| 0.7277777777777777 | 3.525 |
| 0.7284722222222223 | 3.525 |
| 0.7291666666666666 | 3.525 |
| 0.7298611111111111 | 3.525 |
| 0.7305555555555556 | 3.525 |
| 0.7312500000000001 | 3.525 |
| 0.7319444444444444 | 3.525 |
| 0.7326388888888888 | 3.525 |
| 0.7333333333333334 | 3.525 |
| 0.7340277777777778 | 3.525 |
| 0.7347222222222222 | 0 |
| 0.7354166666666666 | 0 |
| 0.7361111111111112 | 0 |
| 0.7368055555555556 | 0 |
| 0.7374999999999999 | 0 |
| 0.7381944444444444 | 0 |
| 0.7388888888888889 | 0 |
| 0.7395833333333334 | 0 |
| 0.7402777777777777 | 0 |
| 0.7409722222222223 | 0 |
| 0.7416666666666667 | 0 |
| 0.7423611111111111 | 0 |
| 0.7430555555555555 | 0 |
| 0.74375 | 0 |
| 0.7444444444444445 | 0 |
| 0.7451388888888889 | 0 |
| 0.7458333333333332 | 0 |
| 0.7465277777777778 | 0 |
| 0.7472222222222222 | 0 |
| 0.7479166666666667 | 0 |
| 0.748611111111111 | 0 |
| 0.7493055555555556 | 0 |
| 0.75 | 0 |
| 0.7506944444444444 | 0 |
| 0.751388888888889 | 0 |
| 0.7520833333333333 | 0 |
| 0.7527777777777778 | 0 |
| 0.7534722222222222 | 0 |
| 0.7541666666666668 | 0 |
| 0.7548611111111111 | 0 |
| 0.7555555555555555 | 0 |
| 0.75625 | 0 |
| 0.7569444444444445 | 0 |
| 0.7576388888888889 | 0 |
| 0.7583333333333333 | 0 |
| 0.7590277777777777 | 0 |
| 0.7597222222222223 | 0 |
| 0.7604166666666666 | 0 |
| 0.7611111111111111 | 0 |
| 0.7618055555555556 | 0 |
| 0.7625000000000001 | 0 |
| 0.7631944444444444 | 0 |
| 0.7638888888888888 | 0 |
| 0.7645833333333334 | 0 |
| 0.7652777777777778 | 0 |
| 0.7659722222222222 | 0 |
| 0.7666666666666666 | 0 |
| 0.7673611111111112 | 0 |
| 0.7680555555555556 | 0 |
| 0.7687499999999999 | 0 |
| 0.7694444444444444 | 0 |
| 0.7701388888888889 | 0 |
| 0.7708333333333334 | 0 |
| 0.7715277777777777 | 0 |
| 0.7722222222222223 | 0 |
| 0.7729166666666667 | 0 |
| 0.7736111111111111 | 0 |
| 0.7743055555555555 | 0 |
| 0.775 | 0 |
| 0.7756944444444445 | 0 |
| 0.7763888888888889 | 0 |
| 0.7770833333333332 | 0 |
| 0.7777777777777778 | 0 |
| 0.7784722222222222 | 0 |
| 0.7791666666666667 | 0 |
| 0.779861111111111 | 0 |
| 0.7805555555555556 | 0 |
| 0.78125 | 0 |
| 0.7819444444444444 | 0 |
| 0.782638888888889 | 0 |
| 0.7833333333333333 | 0 |
| 0.7840277777777778 | 0 |
| 0.7847222222222222 | 0 |
| 0.7854166666666668 | 0 |
| 0.7861111111111111 | 0 |
| 0.7868055555555555 | 0 |
| 0.7875 | 0 |
| 0.7881944444444445 | 0 |
| 0.7888888888888889 | 0 |
| 0.7895833333333333 | 0 |
| 0.7902777777777777 | 0 |
| 0.7909722222222223 | 0 |
| 0.7916666666666666 | 0 |
| 0.7923611111111111 | 0 |
| 0.7930555555555556 | 0 |
| 0.7937500000000001 | 0 |
| 0.7944444444444444 | 0 |
| 0.7951388888888888 | 0 |
| 0.7958333333333334 | 0 |
| 0.7965277777777778 | 0 |
| 0.7972222222222222 | 0 |
| 0.7979166666666666 | 0 |
| 0.7986111111111112 | 0 |
| 0.7993055555555556 | 0 |
| 0.7999999999999999 | 0 |
| 0.8006944444444444 | 0 |
| 0.8013888888888889 | 0 |
| 0.8020833333333334 | 0 |
| 0.8027777777777777 | 0 |
| 0.8034722222222223 | 0 |
| 0.8041666666666667 | 0 |
| 0.8048611111111111 | 0 |
| 0.8055555555555555 | 0 |
| 0.80625 | 0 |
| 0.8069444444444445 | 0 |
| 0.8076388888888889 | 0 |
| 0.8083333333333332 | 0 |
| 0.8090277777777778 | 0 |
| 0.8097222222222222 | 0 |
| 0.8104166666666667 | 0 |
| 0.811111111111111 | 0 |
| 0.8118055555555556 | 0 |
| 0.8125 | 0 |
| 0.8131944444444444 | 0 |
| 0.813888888888889 | 0 |
| 0.8145833333333333 | 0 |
| 0.8152777777777778 | 0 |
| 0.8159722222222222 | 0 |
| 0.8166666666666668 | 0 |
| 0.8173611111111111 | 0 |
| 0.8180555555555555 | 0 |
| 0.81875 | 0 |
| 0.8194444444444445 | 0 |
| 0.8201388888888889 | 0 |
| 0.8208333333333333 | 0 |
| 0.8215277777777777 | 0 |
| 0.8222222222222223 | 0 |
| 0.8229166666666666 | 0 |
| 0.8236111111111111 | 0 |
| 0.8243055555555556 | 0 |
| 0.8250000000000001 | 0 |
| 0.8256944444444444 | 0 |
| 0.8263888888888888 | 0 |
| 0.8270833333333334 | 0 |
| 0.8277777777777778 | 0 |
| 0.8284722222222222 | 0 |
| 0.8291666666666666 | 0 |
| 0.8298611111111112 | 0 |
| 0.8305555555555556 | 0 |
| 0.8312499999999999 | 0 |
| 0.8319444444444444 | 0 |
| 0.8326388888888889 | 0 |
| 0.8333333333333334 | 0 |
| 0.8340277777777777 | 0 |
| 0.8347222222222223 | 0 |
| 0.8354166666666667 | 0 |
| 0.8361111111111111 | 0 |
| 0.8368055555555555 | 0 |
| 0.8375 | 0 |
| 0.8381944444444445 | 0 |
| 0.8388888888888889 | 0 |
| 0.8395833333333332 | 0 |
| 0.8402777777777778 | 0 |
| 0.8409722222222222 | 0 |
| 0.8416666666666667 | 0 |
| 0.842361111111111 | 0 |
| 0.8430555555555556 | 0 |
| 0.84375 | 0 |
| 0.8444444444444444 | 0 |
| 0.845138888888889 | 0 |
| 0.8458333333333333 | 0 |
| 0.8465277777777778 | 0 |
| 0.8472222222222222 | 0 |
| 0.8479166666666668 | 0 |
| 0.8486111111111111 | 0 |
| 0.8493055555555555 | 0 |
| 0.85 | 0 |
| 0.8506944444444445 | 0 |
| 0.8513888888888889 | 0 |
| 0.8520833333333333 | 0 |
| 0.8527777777777777 | 0 |
| 0.8534722222222223 | 0 |
| 0.8541666666666666 | 0 |
| 0.8548611111111111 | 0 |
| 0.8555555555555556 | 0 |
| 0.8562500000000001 | 0 |
| 0.8569444444444444 | 0 |
| 0.8576388888888888 | 0 |
| 0.8583333333333334 | 0 |
| 0.8590277777777778 | 0 |
| 0.8597222222222222 | 0 |
| 0.8604166666666666 | 0 |
| 0.8611111111111112 | 0 |
| 0.8618055555555556 | 0 |
| 0.8624999999999999 | 0 |
| 0.8631944444444444 | 0 |
| 0.8638888888888889 | 0 |
| 0.8645833333333334 | 0 |
| 0.8652777777777777 | 0 |
| 0.8659722222222223 | 0 |
| 0.8666666666666667 | 0 |
| 0.8673611111111111 | 0 |
| 0.8680555555555555 | 0 |
| 0.86875 | 0 |
| 0.8694444444444445 | 0 |
| 0.8701388888888889 | 0 |
| 0.8708333333333332 | 0 |
| 0.8715277777777778 | 0 |
| 0.8722222222222222 | 0 |
| 0.8729166666666667 | 0 |
| 0.873611111111111 | 0 |
| 0.8743055555555556 | 0 |
| 0.875 | 0 |
| 0.8756944444444444 | 0 |
| 0.876388888888889 | 0 |
| 0.8770833333333333 | 0 |
| 0.8777777777777778 | 0 |
| 0.8784722222222222 | 0 |
| 0.8791666666666668 | 0 |
| 0.8798611111111111 | 0 |
| 0.8805555555555555 | 0 |
| 0.88125 | 0 |
| 0.8819444444444445 | 0 |
| 0.8826388888888889 | 0 |
| 0.8833333333333333 | 0 |
| 0.8840277777777777 | 0 |
| 0.8847222222222223 | 0 |
| 0.8854166666666666 | 0 |
| 0.8861111111111111 | 0 |
| 0.8868055555555556 | 0 |
| 0.8875000000000001 | 0 |
| 0.8881944444444444 | 0 |
| 0.8888888888888888 | 0 |
| 0.8895833333333334 | 0 |
| 0.8902777777777778 | 0 |
| 0.8909722222222222 | 0 |
| 0.8916666666666666 | 0 |
| 0.8923611111111112 | 0 |
| 0.8930555555555556 | 0 |
| 0.8937499999999999 | 0 |
| 0.8944444444444444 | 0 |
| 0.8951388888888889 | 0 |
| 0.8958333333333334 | 0 |
| 0.8965277777777777 | 0 |
| 0.8972222222222223 | 0 |
| 0.8979166666666667 | 0 |
| 0.8986111111111111 | 0 |
| 0.8993055555555555 | 0 |
| 0.9 | 0 |
| 0.9006944444444445 | 0 |
| 0.9013888888888889 | 0 |
| 0.9020833333333332 | 0 |
| 0.9027777777777778 | 0 |
| 0.9034722222222222 | 0 |
| 0.9041666666666667 | 0 |
| 0.904861111111111 | 0 |
| 0.9055555555555556 | 0 |
| 0.90625 | 0 |
| 0.9069444444444444 | 0 |
| 0.907638888888889 | 0 |
| 0.9083333333333333 | 0 |
| 0.9090277777777778 | 0 |
| 0.9097222222222222 | 0 |
| 0.9104166666666668 | 0 |
| 0.9111111111111111 | 0 |
| 0.9118055555555555 | 0 |
| 0.9125 | 0 |
| 0.9131944444444445 | 0 |
| 0.9138888888888889 | 0 |
| 0.9145833333333333 | 0 |
| 0.9152777777777777 | 0 |
| 0.9159722222222223 | 0 |
| 0.9166666666666666 | 0 |
| 0.9173611111111111 | 0 |
| 0.9180555555555556 | 0 |
| 0.9187500000000001 | 0 |
| 0.9194444444444444 | 0 |
| 0.9201388888888888 | 0 |
| 0.9208333333333334 | 0 |
| 0.9215277777777778 | 0 |
| 0.9222222222222222 | 0 |
| 0.9229166666666666 | 0 |
| 0.9236111111111112 | 0 |
| 0.9243055555555556 | 0 |
| 0.9249999999999999 | 0 |
| 0.9256944444444444 | 0 |
| 0.9263888888888889 | 0 |
| 0.9270833333333334 | 0 |
| 0.9277777777777777 | 0 |
| 0.9284722222222223 | 0 |
| 0.9291666666666667 | 0 |
| 0.9298611111111111 | 0 |
| 0.9305555555555555 | 0 |
| 0.93125 | 0 |
| 0.9319444444444445 | 0 |
| 0.9326388888888889 | 0 |
| 0.9333333333333332 | 0 |
| 0.9340277777777778 | 0 |
| 0.9347222222222222 | 0 |
| 0.9354166666666667 | 0 |
| 0.936111111111111 | 0 |
| 0.9368055555555556 | 0 |
| 0.9375 | 0 |
| 0.9381944444444444 | 0 |
| 0.938888888888889 | 0 |
| 0.9395833333333333 | 0 |
| 0.9402777777777778 | 0 |
| 0.9409722222222222 | 0 |
| 0.9416666666666668 | 0 |
| 0.9423611111111111 | 0 |
| 0.9430555555555555 | 0 |
| 0.94375 | 0 |
| 0.9444444444444445 | 0 |
| 0.9451388888888889 | 0 |
| 0.9458333333333333 | 0 |
| 0.9465277777777777 | 0 |
| 0.9472222222222223 | 0 |
| 0.9479166666666666 | 0 |
| 0.9486111111111111 | 0 |
| 0.9493055555555556 | 0 |
| 0.9500000000000001 | 0 |
| 0.9506944444444444 | 0 |
| 0.9513888888888888 | 0 |
| 0.9520833333333334 | 0 |
| 0.9527777777777778 | 0 |
| 0.9534722222222222 | 0 |
| 0.9541666666666666 | 0 |
| 0.9548611111111112 | 0 |
| 0.9555555555555556 | 0 |
| 0.9562499999999999 | 0 |
| 0.9569444444444444 | 0 |
| 0.9576388888888889 | 0 |
| 0.9583333333333334 | 0 |
| 0.9590277777777777 | 0 |
| 0.9597222222222223 | 0 |
| 0.9604166666666667 | 0 |
| 0.9611111111111111 | 0 |
| 0.9618055555555555 | 0 |
| 0.9625 | 0 |
| 0.9631944444444445 | 0 |
| 0.9638888888888889 | 0 |
| 0.9645833333333332 | 0 |
| 0.9652777777777778 | 0 |
| 0.9659722222222222 | 0 |
| 0.9666666666666667 | 0 |
| 0.967361111111111 | 0 |
| 0.9680555555555556 | 0 |
| 0.96875 | 0 |
| 0.9694444444444444 | 0 |
| 0.970138888888889 | 0 |
| 0.9708333333333333 | 0 |
| 0.9715277777777778 | 0 |
| 0.9722222222222222 | 0 |
| 0.9729166666666668 | 0 |
| 0.9736111111111111 | 0 |
| 0.9743055555555555 | 0 |
| 0.975 | 0 |
| 0.9756944444444445 | 0 |
| 0.9763888888888889 | 0 |
| 0.9770833333333333 | 0 |
| 0.9777777777777777 | 0 |
| 0.9784722222222223 | 0 |
| 0.9791666666666666 | 0 |
| 0.9798611111111111 | 0 |
| 0.9805555555555556 | 0 |
| 0.9812500000000001 | 0 |
| 0.9819444444444444 | 0 |
| 0.9826388888888888 | 0 |
| 0.9833333333333334 | 0 |
| 0.9840277777777778 | 0 |
| 0.9847222222222222 | 0 |
| 0.9854166666666666 | 0 |
| 0.9861111111111112 | 0 |
| 0.9868055555555556 | 0 |
| 0.9874999999999999 | 0 |
| 0.9881944444444444 | 0 |
| 0.9888888888888889 | 0 |
| 0.9895833333333334 | 0 |
| 0.9902777777777777 | 0 |
| 0.9909722222222223 | 0 |
| 0.9916666666666667 | 0 |
| 0.9923611111111111 | 0 |
| 0.9930555555555555 | 0 |
| 0.99375 | 0 |
| 0.9944444444444445 | 0 |
| 0.9951388888888889 | 0 |
| 0.9958333333333332 | 0 |
| 0.9965277777777778 | 0 |
| 0.9972222222222222 | 0 |
| 0.9979166666666667 | 0 |
| 0.998611111111111 | 0 |
| 0.9993055555555556 | 0 |